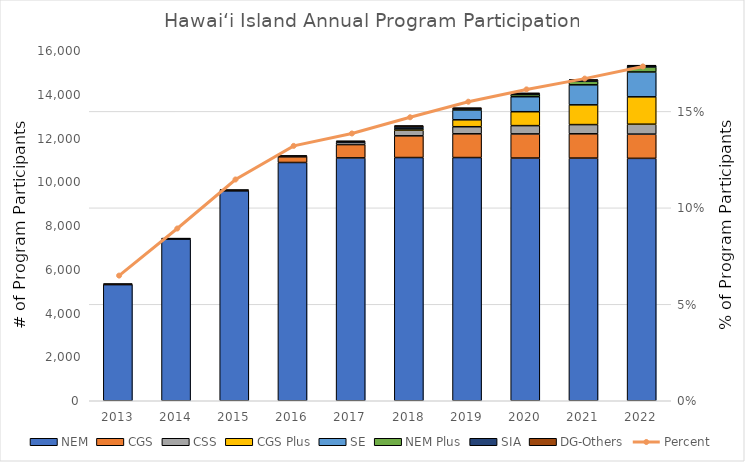
| Category | NEM | CGS | CSS | CGS Plus | SE | NEM Plus | SIA | DG-Others |
|---|---|---|---|---|---|---|---|---|
| 2013.0 | 5314 | 0 | 0 | 0 | 0 | 0 | 22 | 19 |
| 2014.0 | 7394 | 0 | 0 | 0 | 0 | 0 | 25 | 20 |
| 2015.0 | 9605 | 0 | 0 | 0 | 0 | 0 | 33 | 20 |
| 2016.0 | 10903 | 261 | 0 | 0 | 0 | 0 | 37 | 20 |
| 2017.0 | 11114 | 609 | 104 | 0 | 0 | 0 | 42 | 21 |
| 2018.0 | 11130 | 993 | 258 | 61 | 82 | 0 | 44 | 21 |
| 2019.0 | 11129 | 1087 | 324 | 317 | 451 | 28 | 48 | 21 |
| 2020.0 | 11107 | 1104 | 379 | 637 | 687 | 96 | 52 | 21 |
| 2021.0 | 11105 | 1111 | 421 | 905 | 916 | 161 | 55 | 21 |
| 2022.0 | 11093 | 1109 | 453 | 1254 | 1137 | 230 | 57 | 21 |